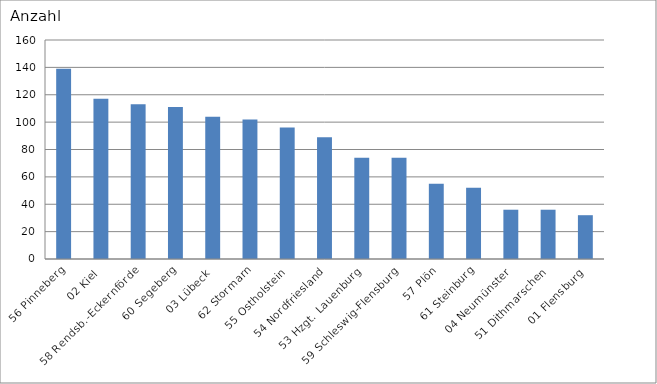
| Category | 56 Pinneberg 02 Kiel 58 Rendsb.-Eckernförde 60 Segeberg 03 Lübeck 62 Stormarn 55 Ostholstein 54 Nordfriesland 53 Hzgt. Lauenburg 59 Schleswig-Flensburg 57 Plön 61 Steinburg 04 Neumünster 51 Dithmarschen 01 Flensburg |
|---|---|
| 56 Pinneberg | 139 |
| 02 Kiel | 117 |
| 58 Rendsb.-Eckernförde | 113 |
| 60 Segeberg | 111 |
| 03 Lübeck | 104 |
| 62 Stormarn | 102 |
| 55 Ostholstein | 96 |
| 54 Nordfriesland | 89 |
| 53 Hzgt. Lauenburg | 74 |
| 59 Schleswig-Flensburg | 74 |
| 57 Plön | 55 |
| 61 Steinburg | 52 |
| 04 Neumünster | 36 |
| 51 Dithmarschen | 36 |
| 01 Flensburg | 32 |